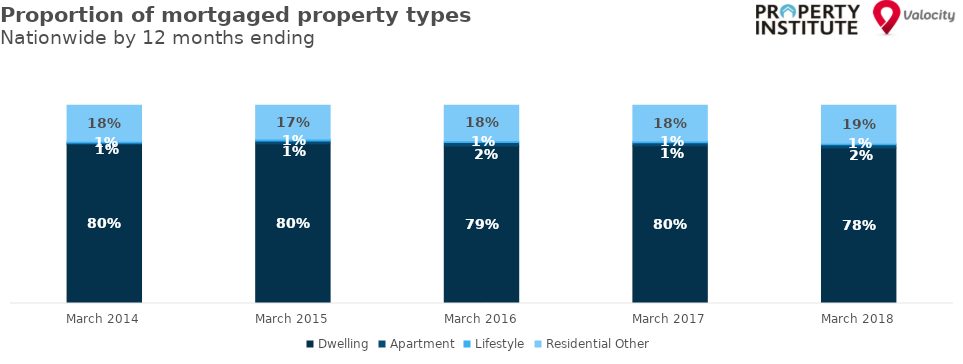
| Category | Dwelling | Apartment | Lifestyle | Residential Other |
|---|---|---|---|---|
| 2014-03-01 | 0.803 | 0.006 | 0.009 | 0.182 |
| 2015-03-01 | 0.805 | 0.014 | 0.01 | 0.171 |
| 2016-03-01 | 0.795 | 0.017 | 0.01 | 0.179 |
| 2017-03-01 | 0.796 | 0.014 | 0.009 | 0.181 |
| 2018-03-01 | 0.783 | 0.017 | 0.008 | 0.192 |